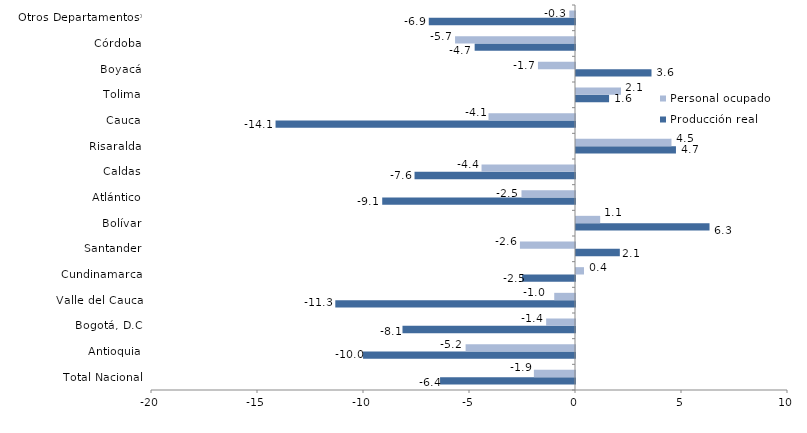
| Category | Producción real | Personal ocupado |
|---|---|---|
| Total Nacional | -6.365 | -1.939 |
| Antioquia | -9.998 | -5.16 |
| Bogotá, D.C | -8.138 | -1.361 |
| Valle del Cauca | -11.307 | -0.98 |
| Cundinamarca | -2.496 | 0.377 |
| Santander | 2.067 | -2.598 |
| Bolívar | 6.299 | 1.141 |
| Atlántico | -9.094 | -2.524 |
| Caldas | -7.569 | -4.409 |
| Risaralda | 4.715 | 4.504 |
| Cauca | -14.125 | -4.079 |
| Tolima | 1.56 | 2.122 |
| Boyacá | 3.561 | -1.747 |
| Córdoba | -4.733 | -5.657 |
| Otros Departamentos* | -6.897 | -0.269 |